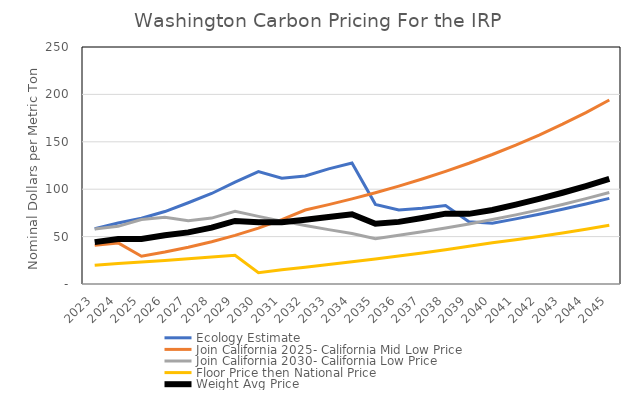
| Category | Ecology Estimate | Join California 2025- California Mid Low Price | Join California 2030- California Low Price | Floor Price then National Price | Weight Avg Price |
|---|---|---|---|---|---|
| 2023.0 | 58.31 | 40.74 | 58 | 19.7 | 44.188 |
| 2024.0 | 64.27 | 43.344 | 60.805 | 21.67 | 47.523 |
| 2025.0 | 69.358 | 29.34 | 67.998 | 23.187 | 47.471 |
| 2026.0 | 76.426 | 33.74 | 70.385 | 24.81 | 51.34 |
| 2027.0 | 85.698 | 38.799 | 66.711 | 26.547 | 54.439 |
| 2028.0 | 95.482 | 44.617 | 69.523 | 28.405 | 59.507 |
| 2029.0 | 107.535 | 51.307 | 76.675 | 30.393 | 66.478 |
| 2030.0 | 118.519 | 59 | 71.308 | 12 | 65.207 |
| 2031.0 | 111.651 | 67.847 | 66.316 | 15.031 | 65.211 |
| 2032.0 | 113.957 | 78.02 | 61.674 | 17.692 | 67.836 |
| 2033.0 | 121.394 | 83.693 | 57.357 | 20.469 | 70.728 |
| 2034.0 | 127.649 | 89.763 | 53.342 | 23.362 | 73.529 |
| 2035.0 | 84.012 | 96.264 | 47.874 | 26.379 | 63.632 |
| 2036.0 | 78.008 | 103.244 | 51.345 | 29.519 | 65.529 |
| 2037.0 | 79.854 | 110.733 | 55.065 | 32.789 | 69.61 |
| 2038.0 | 82.739 | 118.761 | 59.056 | 36.194 | 74.188 |
| 2039.0 | 65.557 | 127.366 | 63.343 | 39.737 | 74.001 |
| 2040.0 | 64.129 | 136.597 | 67.948 | 43.427 | 78.025 |
| 2041.0 | 68.69 | 146.513 | 72.889 | 46.632 | 83.681 |
| 2042.0 | 73.558 | 157.163 | 78.194 | 50.084 | 89.75 |
| 2043.0 | 78.777 | 168.591 | 83.895 | 53.798 | 96.265 |
| 2044.0 | 84.378 | 180.863 | 90.015 | 57.788 | 103.261 |
| 2045.0 | 90.363 | 194.048 | 96.592 | 62.076 | 110.77 |